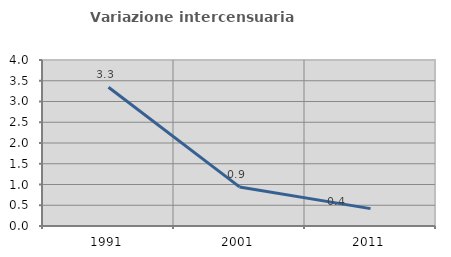
| Category | Variazione intercensuaria annua |
|---|---|
| 1991.0 | 3.344 |
| 2001.0 | 0.942 |
| 2011.0 | 0.419 |